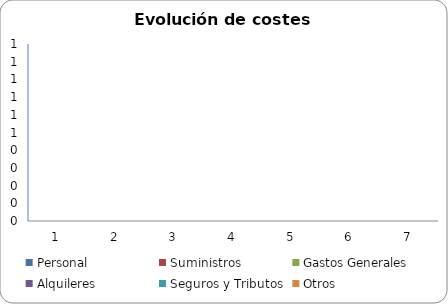
| Category | Personal | Suministros | Gastos Generales | Alquileres | Seguros y Tributos | Otros |
|---|---|---|---|---|---|---|
| 0 | 0 | 0 | 0 | 0 | 0 | 0 |
| 1 | 0 | 0 | 0 | 0 | 0 | 0 |
| 2 | 0 | 0 | 0 | 0 | 0 | 0 |
| 3 | 0 | 0 | 0 | 0 | 0 | 0 |
| 4 | 0 | 0 | 0 | 0 | 0 | 0 |
| 5 | 0 | 0 | 0 | 0 | 0 | 0 |
| 6 | 0 | 0 | 0 | 0 | 0 | 0 |